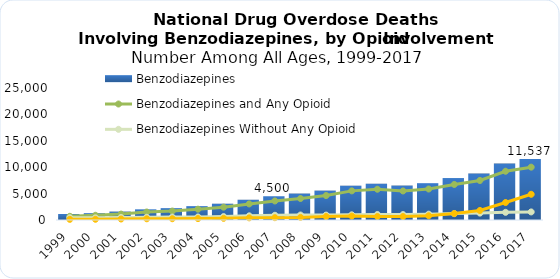
| Category | Benzodiazepines |
|---|---|
| 1999.0 | 1135 |
| 2000.0 | 1298 |
| 2001.0 | 1594 |
| 2002.0 | 2022 |
| 2003.0 | 2248 |
| 2004.0 | 2627 |
| 2005.0 | 3084 |
| 2006.0 | 3835 |
| 2007.0 | 4500 |
| 2008.0 | 5010 |
| 2009.0 | 5567 |
| 2010.0 | 6497 |
| 2011.0 | 6872 |
| 2012.0 | 6524 |
| 2013.0 | 6973 |
| 2014.0 | 7945 |
| 2015.0 | 8791 |
| 2016.0 | 10684 |
| 2017.0 | 11537 |